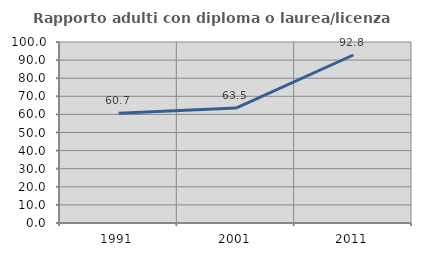
| Category | Rapporto adulti con diploma o laurea/licenza media  |
|---|---|
| 1991.0 | 60.655 |
| 2001.0 | 63.474 |
| 2011.0 | 92.815 |